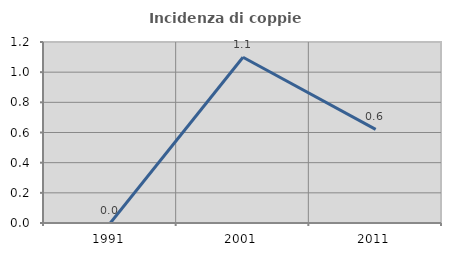
| Category | Incidenza di coppie miste |
|---|---|
| 1991.0 | 0 |
| 2001.0 | 1.099 |
| 2011.0 | 0.621 |